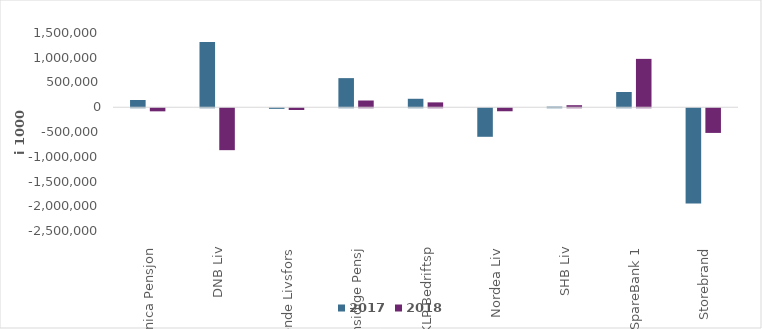
| Category | 2017 | 2018 |
|---|---|---|
| Danica Pensjon | 146462.129 | -62184.461 |
| DNB Liv | 1318704 | -846689 |
| Frende Livsfors | -12006 | -35262.409 |
| Gjensidige Pensj | 588342 | 136390 |
| KLP Bedriftsp | 171225 | 98497 |
| Nordea Liv | -576666.141 | -60654.123 |
| SHB Liv | 13253 | 41666 |
| SpareBank 1 | 308703.245 | 977355.965 |
| Storebrand | -1926593.096 | -498335.653 |